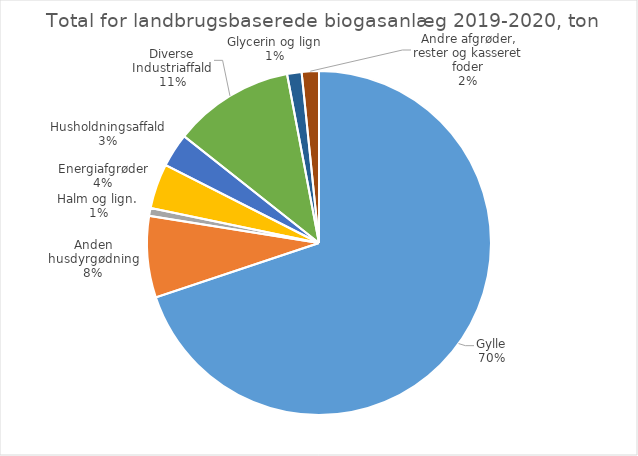
| Category | Series 0 |
|---|---|
| Gylle | 8162070.265 |
| Anden husdyrgødning | 893200.555 |
| Halm og lign.  | 85689.56 |
| Energiafgrøder | 493461.06 |
| Husholdningsaffald | 370119.14 |
| Diverse Industriaffald | 1327799.011 |
| Glycerin og lign | 159099.18 |
| Andre afgrøder, rester og kasseret foder | 188742.82 |